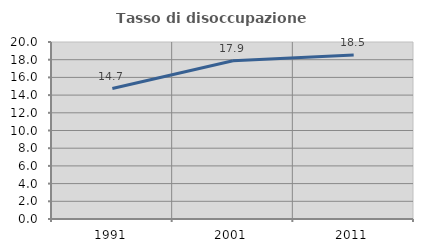
| Category | Tasso di disoccupazione giovanile  |
|---|---|
| 1991.0 | 14.741 |
| 2001.0 | 17.886 |
| 2011.0 | 18.519 |